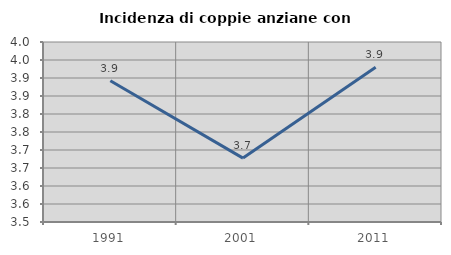
| Category | Incidenza di coppie anziane con figli |
|---|---|
| 1991.0 | 3.892 |
| 2001.0 | 3.678 |
| 2011.0 | 3.93 |